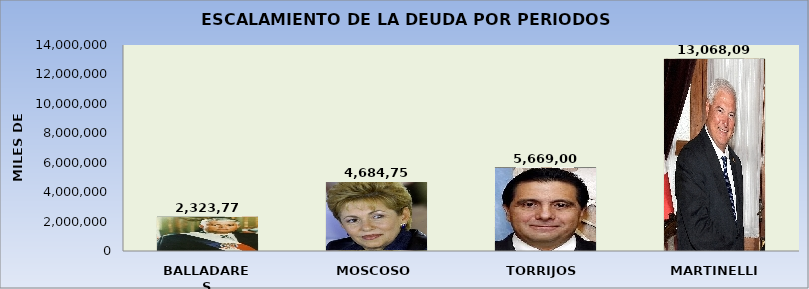
| Category | Series 0 |
|---|---|
| BALLADARES | 2323773 |
| MOSCOSO | 4684753 |
| TORRIJOS | 5669004 |
| MARTINELLI | 13068093.672 |